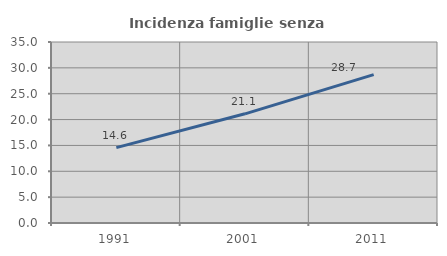
| Category | Incidenza famiglie senza nuclei |
|---|---|
| 1991.0 | 14.567 |
| 2001.0 | 21.114 |
| 2011.0 | 28.699 |